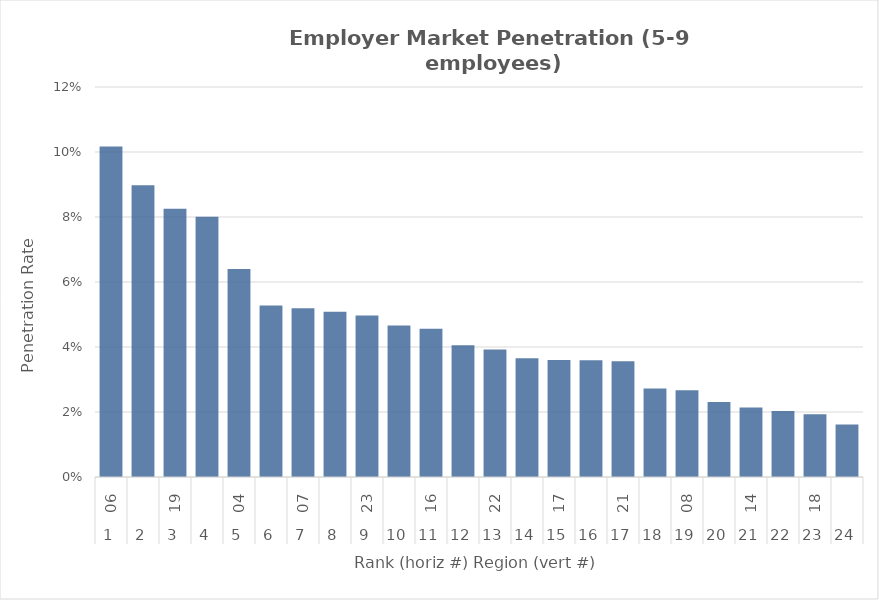
| Category | Rate |
|---|---|
| 0 | 0.102 |
| 1 | 0.09 |
| 2 | 0.083 |
| 3 | 0.08 |
| 4 | 0.064 |
| 5 | 0.053 |
| 6 | 0.052 |
| 7 | 0.051 |
| 8 | 0.05 |
| 9 | 0.047 |
| 10 | 0.046 |
| 11 | 0.041 |
| 12 | 0.039 |
| 13 | 0.037 |
| 14 | 0.036 |
| 15 | 0.036 |
| 16 | 0.036 |
| 17 | 0.027 |
| 18 | 0.027 |
| 19 | 0.023 |
| 20 | 0.021 |
| 21 | 0.02 |
| 22 | 0.019 |
| 23 | 0.016 |